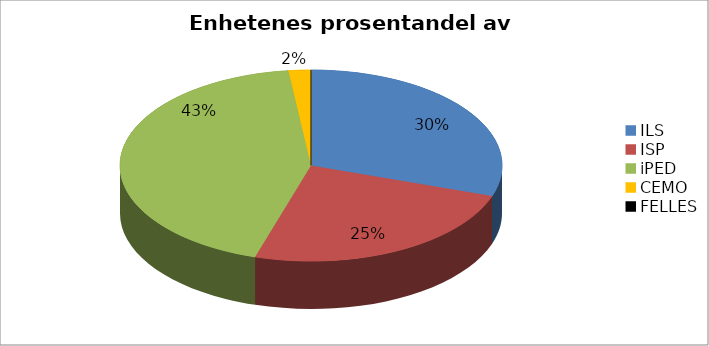
| Category | Series 0 |
|---|---|
| ILS | 11952000 |
| ISP | 9711000 |
| iPED | 17181000 |
| CEMO | 747000 |
| FELLES | 0 |